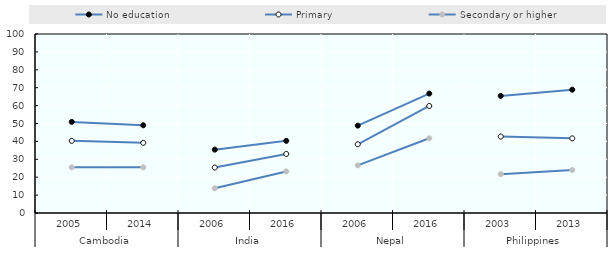
| Category | No education | Primary | Secondary or higher |
|---|---|---|---|
| 0 | 50.9 | 40.3 | 25.5 |
| 1 | 49 | 39.2 | 25.5 |
| 2 | 35.4 | 25.402 | 13.782 |
| 3 | 40.3 | 32.98 | 23.206 |
| 4 | 48.8 | 38.4 | 26.625 |
| 5 | 66.7 | 59.8 | 41.728 |
| 6 | 65.4 | 42.7 | 21.713 |
| 7 | 68.9 | 41.7 | 24.011 |